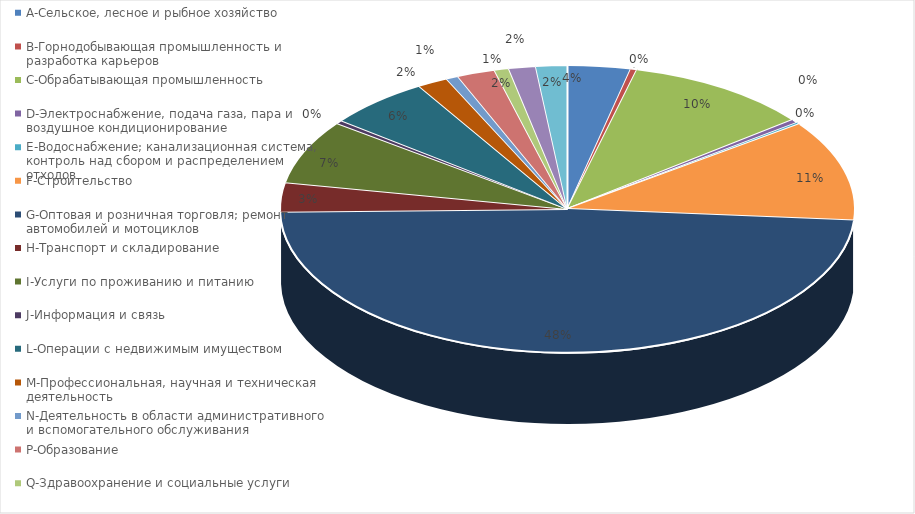
| Category | Series 0 |
|---|---|
| A-Сельское, лесное и рыбное хозяйство | 0.035 |
| B-Горнодобывающая промышленность и разработка карьеров | 0.004 |
| C-Обрабатывающая промышленность | 0.105 |
| D-Электроснабжение, подача газа, пара и воздушное кондиционирование | 0.004 |
| E-Водоснабжение; канализационная система, контроль над сбором и распределением отходов | 0.002 |
| F-Строительство | 0.113 |
| G-Оптовая и розничная торговля; ремонт автомобилей и мотоциклов | 0.484 |
| H-Транспорт и складирование | 0.033 |
| I-Услуги по проживанию и питанию | 0.072 |
| J-Информация и связь | 0.004 |
| L-Операции с недвижимым имуществом | 0.058 |
| M-Профессиональная, научная и техническая деятельность | 0.017 |
| N-Деятельность в области административного и вспомогательного обслуживания | 0.007 |
| P-Образование | 0.021 |
| Q-Здравоохранение и социальные услуги | 0.008 |
| R-Искусство, развлечения и отдых | 0.015 |
| S-Предоставление прочих видов услуг | 0.018 |